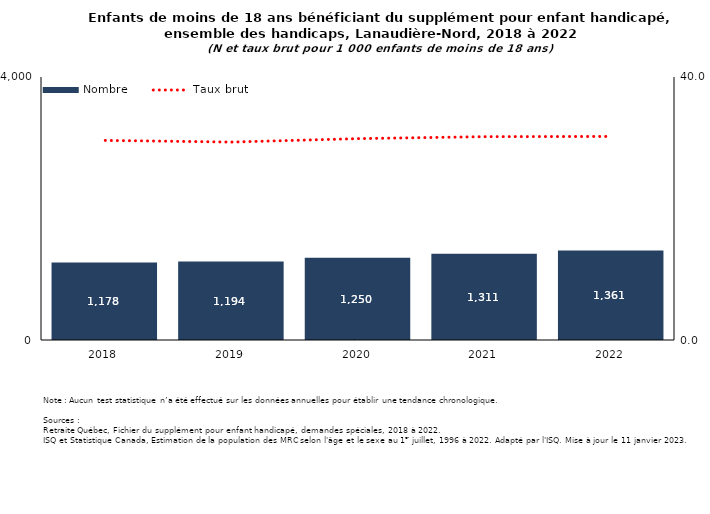
| Category | Nombre |
|---|---|
| 2018.0 | 1178 |
| 2019.0 | 1194 |
| 2020.0 | 1250 |
| 2021.0 | 1311 |
| 2022.0 | 1361 |